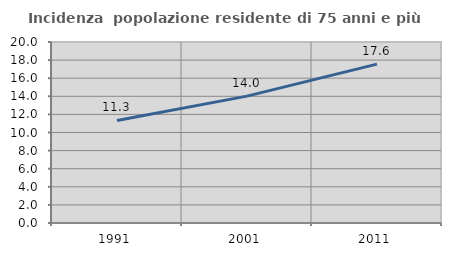
| Category | Incidenza  popolazione residente di 75 anni e più |
|---|---|
| 1991.0 | 11.331 |
| 2001.0 | 14.022 |
| 2011.0 | 17.555 |